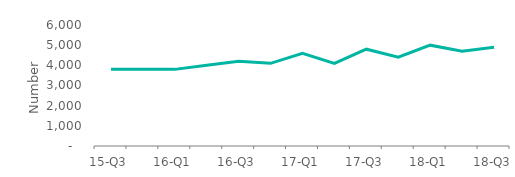
| Category | Full market |
|---|---|
| 15-Q3 | 3800 |
| 15-Q4 | 3800 |
| 16-Q1 | 3800 |
| 16-Q2 | 4000 |
| 16-Q3 | 4200 |
| 16-Q4 | 4100 |
| 17-Q1 | 4600 |
| 17-Q2 | 4100 |
| 17-Q3 | 4800 |
| 17-Q4 | 4400 |
| 18-Q1 | 5000 |
| 18-Q2 | 4700 |
| 18-Q3 | 4900 |